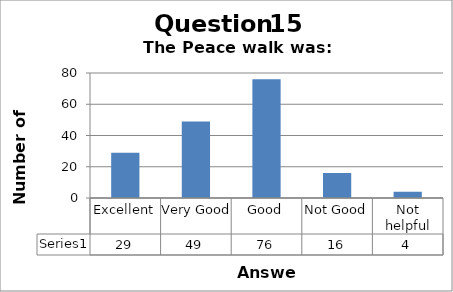
| Category | Series 0 |
|---|---|
| Excellent | 29 |
| Very Good | 49 |
| Good | 76 |
| Not Good | 16 |
| Not helpful | 4 |